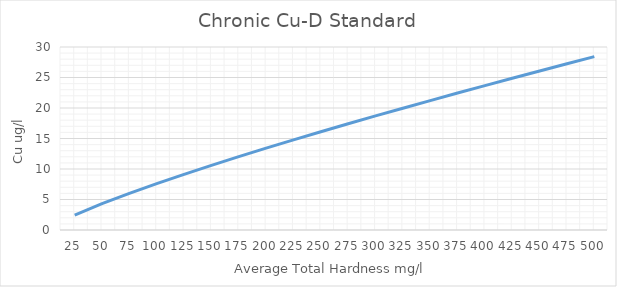
| Category | Chronic Cu-D Standard |
|---|---|
| 25.0 | 2.444 |
| 50.0 | 4.311 |
| 75.0 | 6.009 |
| 100.0 | 7.605 |
| 125.0 | 9.13 |
| 150.0 | 10.601 |
| 175.0 | 12.027 |
| 200.0 | 13.417 |
| 225.0 | 14.776 |
| 250.0 | 16.107 |
| 275.0 | 17.415 |
| 300.0 | 18.701 |
| 325.0 | 19.968 |
| 350.0 | 21.218 |
| 375.0 | 22.451 |
| 400.0 | 23.67 |
| 425.0 | 24.875 |
| 450.0 | 26.067 |
| 475.0 | 27.247 |
| 500.0 | 28.416 |